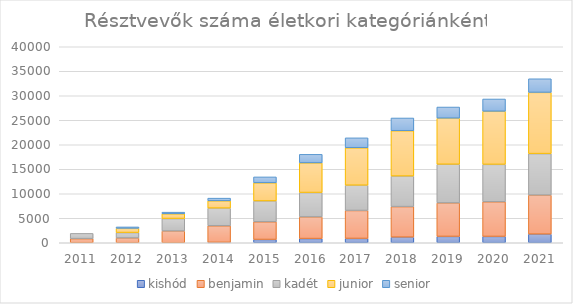
| Category | kishód | benjamin | kadét | junior | senior |
|---|---|---|---|---|---|
| 2011 | 0 | 835 | 1072 | 0 | 0 |
| 2012 | 0 | 967 | 1110 | 869 | 287 |
| 2013 | 0 | 2390 | 2550 | 965 | 341 |
| 2014 | 75 | 3383 | 3610 | 1489 | 549 |
| 2015 | 666 | 3609 | 4257 | 3698 | 1208 |
| 2016 | 854 | 4419 | 4974 | 6054 | 1745 |
| 2017 | 879 | 5703 | 5155 | 7647 | 2027 |
| 2018 | 1145 | 6232 | 6232 | 9254 | 2601 |
| 2019 | 1293 | 6834 | 7893 | 9404 | 2278 |
| 2020 | 1290 | 7066 | 7640 | 10840 | 2505 |
| 2021 | 1760 | 7963 | 8469 | 12491 | 2784 |